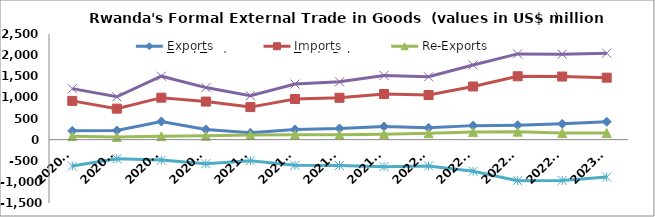
| Category | Exports | Imports | Re-Exports | Total Trade | Trade Balance |
|---|---|---|---|---|---|
| 2020Q1 | 207.949 | 916.682 | 82.251 | 1206.882 | -626.482 |
| 2020Q2 | 217.212 | 733.503 | 62.646 | 1013.36 | -453.645 |
| 2020Q3 | 428.782 | 993.108 | 79.358 | 1501.248 | -484.969 |
| 2020Q4 | 241.354 | 900.349 | 89.908 | 1231.61 | -569.087 |
| 2021Q1 | 161.833 | 769.764 | 108.588 | 1040.184 | -499.344 |
| 2021Q2 | 239.882 | 961.439 | 114.995 | 1316.316 | -606.562 |
| 2021Q3 | 263.451 | 990.421 | 114.805 | 1368.678 | -612.164 |
| 2021Q4 | 310.56 | 1079.656 | 129.387 | 1519.603 | -639.708 |
| 2022Q1 | 280.673 | 1055.385 | 150.457 | 1486.514 | -624.255 |
| 2022Q2 | 331.325 | 1257.717 | 178.235 | 1767.276 | -748.157 |
| 2022Q3 | 341.036 | 1499.805 | 187.729 | 2028.57 | -971.04 |
| 2022Q4 | 373.389 | 1493.34 | 154.392 | 2021.122 | -965.559 |
| 2023Q1 | 423.886 | 1466.903 | 156.235 | 2047.024 | -886.782 |